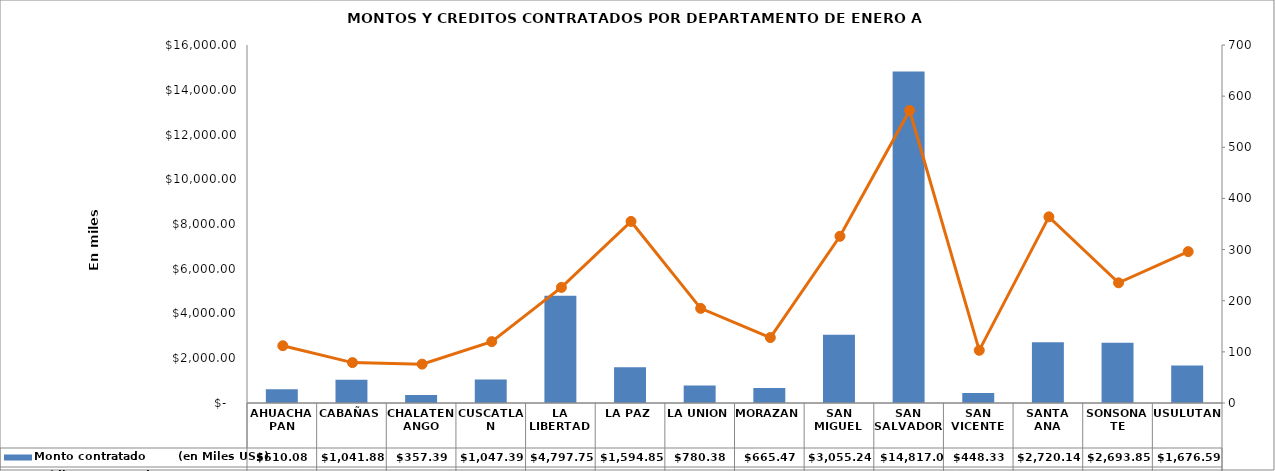
| Category | Monto contratado        (en Miles US$) |
|---|---|
| AHUACHAPAN | 610.076 |
| CABAÑAS | 1041.882 |
| CHALATENANGO | 357.392 |
| CUSCATLAN | 1047.395 |
| LA LIBERTAD | 4797.746 |
| LA PAZ | 1594.848 |
| LA UNION | 780.384 |
| MORAZAN | 665.467 |
| SAN MIGUEL | 3055.244 |
| SAN SALVADOR | 14817.021 |
| SAN VICENTE | 448.326 |
| SANTA ANA | 2720.138 |
| SONSONATE | 2693.848 |
| USULUTAN | 1676.588 |